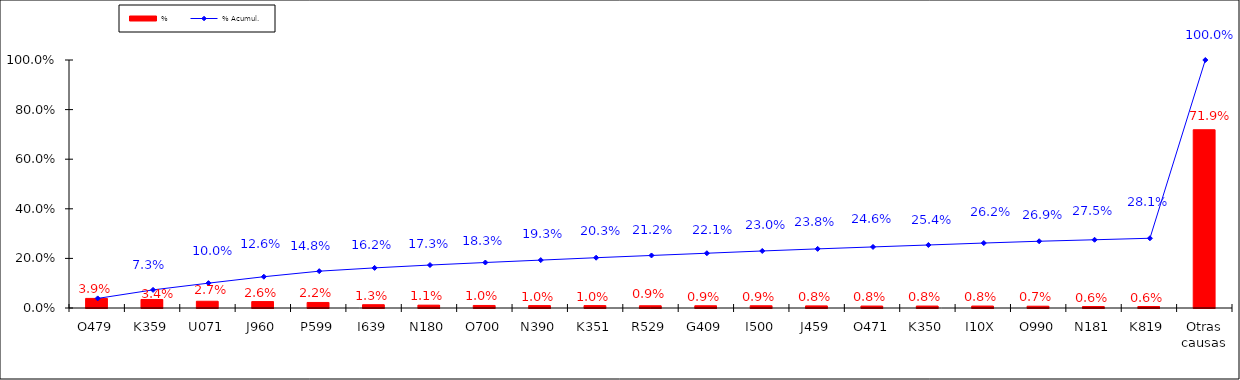
| Category | % |
|---|---|
| O479 | 0.039 |
| K359 | 0.034 |
| U071 | 0.027 |
| J960 | 0.026 |
| P599 | 0.022 |
| I639 | 0.013 |
| N180 | 0.011 |
| O700 | 0.01 |
| N390 | 0.01 |
| K351 | 0.01 |
| R529 | 0.009 |
| G409 | 0.009 |
| I500 | 0.009 |
| J459 | 0.008 |
| O471 | 0.008 |
| K350 | 0.008 |
| I10X | 0.008 |
| O990 | 0.007 |
| N181 | 0.006 |
| K819 | 0.006 |
| Otras causas | 0.719 |